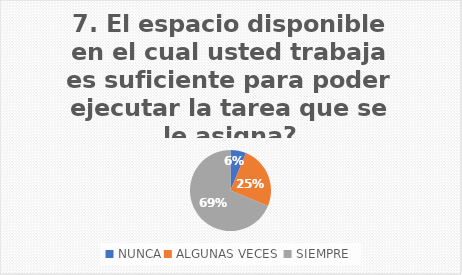
| Category | El espacio disponible en el cual usted trabaja es suficiente para poder ejecutar la tarea que se le asigna? |
|---|---|
| NUNCA | 6.25 |
| ALGUNAS VECES  | 25 |
| SIEMPRE | 68.75 |